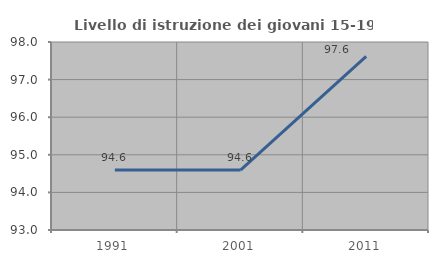
| Category | Livello di istruzione dei giovani 15-19 anni |
|---|---|
| 1991.0 | 94.595 |
| 2001.0 | 94.595 |
| 2011.0 | 97.619 |